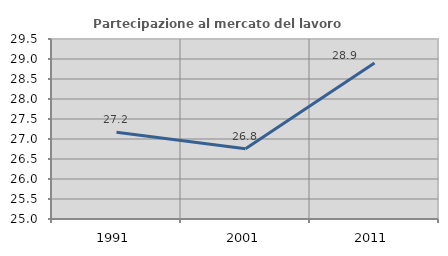
| Category | Partecipazione al mercato del lavoro  femminile |
|---|---|
| 1991.0 | 27.17 |
| 2001.0 | 26.758 |
| 2011.0 | 28.903 |